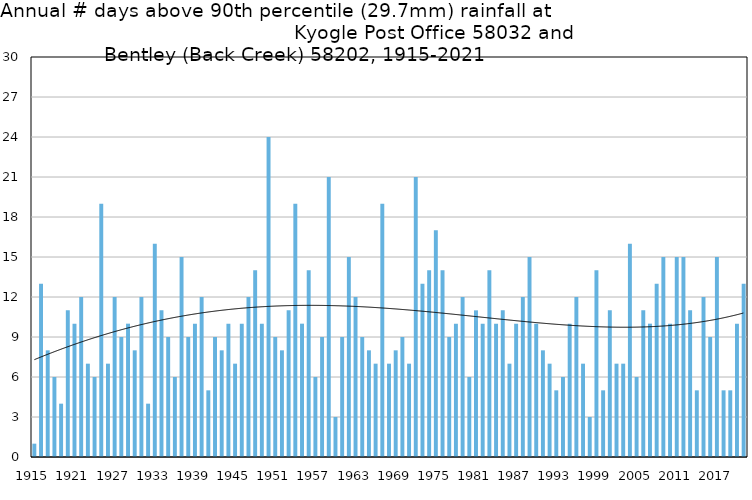
| Category | Annual # days above 90th percentile |
|---|---|
| 1915 | 1 |
| 1916 | 13 |
| 1917 | 8 |
| 1918 | 6 |
| 1919 | 4 |
| 1920 | 11 |
| 1921 | 10 |
| 1922 | 12 |
| 1923 | 7 |
| 1924 | 6 |
| 1925 | 19 |
| 1926 | 7 |
| 1927 | 12 |
| 1928 | 9 |
| 1929 | 10 |
| 1930 | 8 |
| 1931 | 12 |
| 1932 | 4 |
| 1933 | 16 |
| 1934 | 11 |
| 1935 | 9 |
| 1936 | 6 |
| 1937 | 15 |
| 1938 | 9 |
| 1939 | 10 |
| 1940 | 12 |
| 1941 | 5 |
| 1942 | 9 |
| 1943 | 8 |
| 1944 | 10 |
| 1945 | 7 |
| 1946 | 10 |
| 1947 | 12 |
| 1948 | 14 |
| 1949 | 10 |
| 1950 | 24 |
| 1951 | 9 |
| 1952 | 8 |
| 1953 | 11 |
| 1954 | 19 |
| 1955 | 10 |
| 1956 | 14 |
| 1957 | 6 |
| 1958 | 9 |
| 1959 | 21 |
| 1960 | 3 |
| 1961 | 9 |
| 1962 | 15 |
| 1963 | 12 |
| 1964 | 9 |
| 1965 | 8 |
| 1966 | 7 |
| 1967 | 19 |
| 1968 | 7 |
| 1969 | 8 |
| 1970 | 9 |
| 1971 | 7 |
| 1972 | 21 |
| 1973 | 13 |
| 1974 | 14 |
| 1975 | 17 |
| 1976 | 14 |
| 1977 | 9 |
| 1978 | 10 |
| 1979 | 12 |
| 1980 | 6 |
| 1981 | 11 |
| 1982 | 10 |
| 1983 | 14 |
| 1984 | 10 |
| 1985 | 11 |
| 1986 | 7 |
| 1987 | 10 |
| 1988 | 12 |
| 1989 | 15 |
| 1990 | 10 |
| 1991 | 8 |
| 1992 | 7 |
| 1993 | 5 |
| 1994 | 6 |
| 1995 | 10 |
| 1996 | 12 |
| 1997 | 7 |
| 1998 | 3 |
| 1999 | 14 |
| 2000 | 5 |
| 2001 | 11 |
| 2002 | 7 |
| 2003 | 7 |
| 2004 | 16 |
| 2005 | 6 |
| 2006 | 11 |
| 2007 | 10 |
| 2008 | 13 |
| 2009 | 15 |
| 2010 | 10 |
| 2011 | 15 |
| 2012 | 15 |
| 2013 | 11 |
| 2014 | 5 |
| 2015 | 12 |
| 2016 | 9 |
| 2017 | 15 |
| 2018 | 5 |
| 2019 | 5 |
| 2020 | 10 |
| 2021 | 13 |